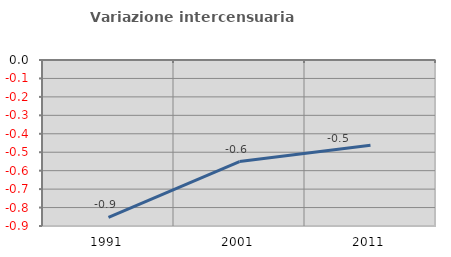
| Category | Variazione intercensuaria annua |
|---|---|
| 1991.0 | -0.853 |
| 2001.0 | -0.55 |
| 2011.0 | -0.462 |